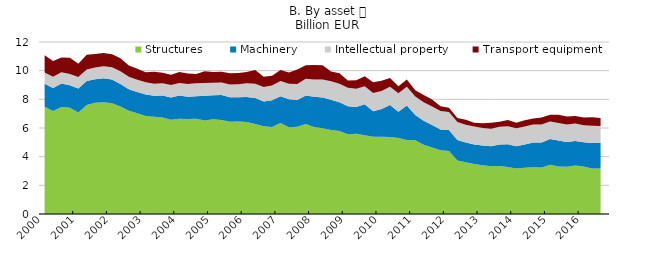
| Category | Structures | Machinery | Intellectual property | Transport equipment |
|---|---|---|---|---|
| 2000-03-31 | 7.485 | 1.607 | 0.782 | 1.195 |
| 2000-06-30 | 7.186 | 1.599 | 0.786 | 1.101 |
| 2000-09-30 | 7.471 | 1.635 | 0.787 | 1.029 |
| 2000-12-31 | 7.406 | 1.572 | 0.789 | 1.139 |
| 2001-03-31 | 7.075 | 1.687 | 0.792 | 0.921 |
| 2001-06-30 | 7.612 | 1.667 | 0.8 | 1.036 |
| 2001-09-30 | 7.753 | 1.656 | 0.817 | 0.935 |
| 2001-12-31 | 7.797 | 1.676 | 0.839 | 0.923 |
| 2002-03-31 | 7.734 | 1.651 | 0.862 | 0.906 |
| 2002-06-30 | 7.506 | 1.571 | 0.876 | 0.912 |
| 2002-09-30 | 7.202 | 1.498 | 0.877 | 0.781 |
| 2002-12-31 | 7.026 | 1.482 | 0.866 | 0.751 |
| 2003-03-31 | 6.834 | 1.502 | 0.85 | 0.705 |
| 2003-06-30 | 6.784 | 1.47 | 0.842 | 0.834 |
| 2003-09-30 | 6.728 | 1.541 | 0.845 | 0.735 |
| 2003-12-31 | 6.583 | 1.552 | 0.859 | 0.728 |
| 2004-03-31 | 6.642 | 1.623 | 0.883 | 0.76 |
| 2004-06-30 | 6.628 | 1.545 | 0.898 | 0.739 |
| 2004-09-30 | 6.653 | 1.57 | 0.902 | 0.65 |
| 2004-12-31 | 6.528 | 1.722 | 0.895 | 0.81 |
| 2005-03-31 | 6.618 | 1.664 | 0.882 | 0.747 |
| 2005-06-30 | 6.552 | 1.748 | 0.88 | 0.75 |
| 2005-09-30 | 6.437 | 1.707 | 0.891 | 0.781 |
| 2005-12-31 | 6.45 | 1.686 | 0.917 | 0.775 |
| 2006-03-31 | 6.416 | 1.747 | 0.952 | 0.784 |
| 2006-06-30 | 6.277 | 1.819 | 0.985 | 0.96 |
| 2006-09-30 | 6.123 | 1.721 | 1.012 | 0.718 |
| 2006-12-31 | 6.073 | 1.864 | 1.033 | 0.668 |
| 2007-03-31 | 6.354 | 1.863 | 1.053 | 0.78 |
| 2007-06-30 | 6.057 | 1.945 | 1.078 | 0.787 |
| 2007-09-30 | 6.082 | 1.88 | 1.116 | 0.999 |
| 2007-12-31 | 6.281 | 1.984 | 1.164 | 0.943 |
| 2008-03-31 | 6.07 | 2.112 | 1.209 | 0.999 |
| 2008-06-30 | 5.988 | 2.143 | 1.252 | 0.991 |
| 2008-09-30 | 5.862 | 2.116 | 1.28 | 0.679 |
| 2008-12-31 | 5.784 | 2.006 | 1.29 | 0.733 |
| 2009-03-31 | 5.567 | 1.956 | 1.29 | 0.507 |
| 2009-06-30 | 5.599 | 1.861 | 1.281 | 0.587 |
| 2009-09-30 | 5.495 | 2.155 | 1.272 | 0.692 |
| 2009-12-31 | 5.39 | 1.783 | 1.266 | 0.749 |
| 2010-03-31 | 5.384 | 1.934 | 1.267 | 0.713 |
| 2010-06-30 | 5.366 | 2.242 | 1.275 | 0.612 |
| 2010-09-30 | 5.309 | 1.824 | 1.286 | 0.493 |
| 2010-12-31 | 5.158 | 2.416 | 1.302 | 0.513 |
| 2011-03-31 | 5.14 | 1.76 | 1.295 | 0.441 |
| 2011-06-30 | 4.823 | 1.682 | 1.299 | 0.502 |
| 2011-09-30 | 4.634 | 1.575 | 1.299 | 0.479 |
| 2011-12-31 | 4.444 | 1.45 | 1.296 | 0.332 |
| 2012-03-31 | 4.402 | 1.453 | 1.266 | 0.291 |
| 2012-06-30 | 3.731 | 1.433 | 1.253 | 0.284 |
| 2012-09-30 | 3.602 | 1.383 | 1.246 | 0.34 |
| 2012-12-31 | 3.49 | 1.363 | 1.245 | 0.277 |
| 2013-03-31 | 3.394 | 1.382 | 1.224 | 0.329 |
| 2013-06-30 | 3.34 | 1.386 | 1.226 | 0.416 |
| 2013-09-30 | 3.351 | 1.491 | 1.238 | 0.355 |
| 2013-12-31 | 3.283 | 1.584 | 1.259 | 0.433 |
| 2014-03-31 | 3.17 | 1.561 | 1.252 | 0.378 |
| 2014-06-30 | 3.219 | 1.622 | 1.259 | 0.438 |
| 2014-09-30 | 3.263 | 1.726 | 1.264 | 0.404 |
| 2014-12-31 | 3.236 | 1.744 | 1.266 | 0.485 |
| 2015-03-31 | 3.434 | 1.791 | 1.234 | 0.459 |
| 2015-06-30 | 3.309 | 1.818 | 1.22 | 0.575 |
| 2015-09-30 | 3.3 | 1.727 | 1.212 | 0.554 |
| 2015-12-31 | 3.376 | 1.717 | 1.213 | 0.528 |
| 2016-03-31 | 3.316 | 1.694 | 1.181 | 0.543 |
| 2016-06-30 | 3.181 | 1.775 | 1.204 | 0.597 |
| 2016-09-30 | 3.18 | 1.781 | 1.172 | 0.559 |